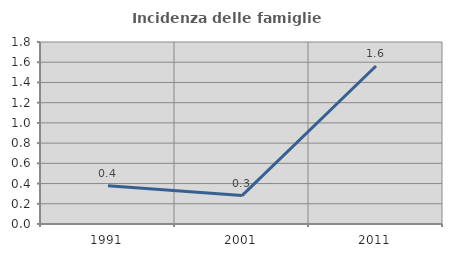
| Category | Incidenza delle famiglie numerose |
|---|---|
| 1991.0 | 0.377 |
| 2001.0 | 0.281 |
| 2011.0 | 1.562 |